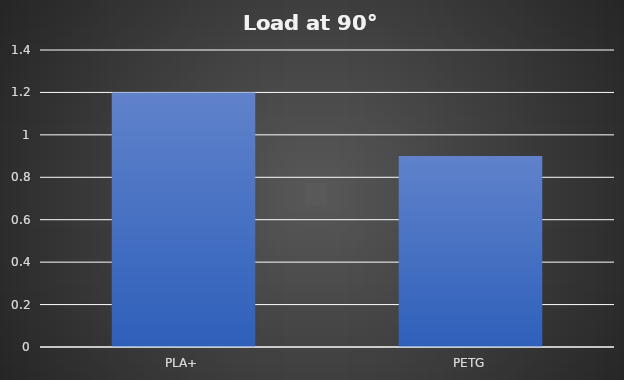
| Category | Load at 90° |
|---|---|
| PLA+ | 1.2 |
| PETG | 0.9 |